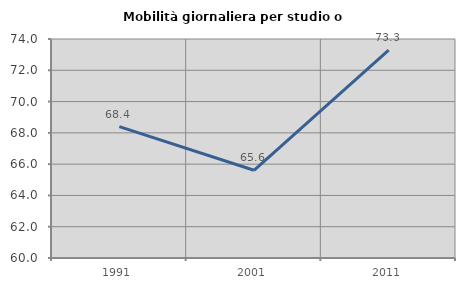
| Category | Mobilità giornaliera per studio o lavoro |
|---|---|
| 1991.0 | 68.395 |
| 2001.0 | 65.608 |
| 2011.0 | 73.285 |